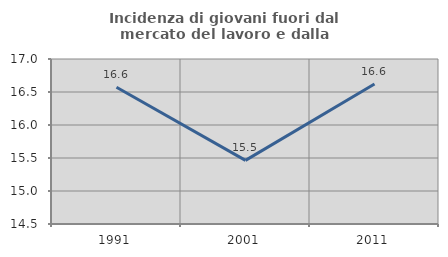
| Category | Incidenza di giovani fuori dal mercato del lavoro e dalla formazione  |
|---|---|
| 1991.0 | 16.572 |
| 2001.0 | 15.464 |
| 2011.0 | 16.621 |